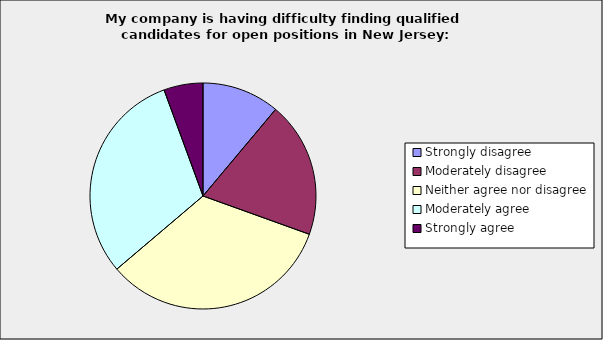
| Category | Series 0 |
|---|---|
| Strongly disagree | 0.111 |
| Moderately disagree | 0.194 |
| Neither agree nor disagree | 0.333 |
| Moderately agree | 0.306 |
| Strongly agree | 0.056 |